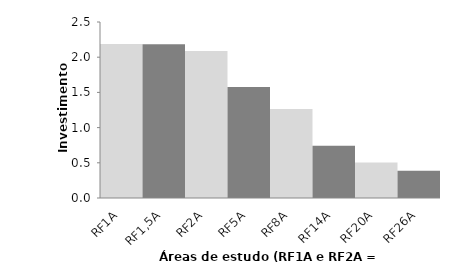
| Category | Series 0 |
|---|---|
| RF1A | 2.187 |
| RF1,5A | 2.184 |
| RF2A | 2.089 |
| RF5A | 1.577 |
| RF8A | 1.264 |
| RF14A | 0.743 |
| RF20A | 0.505 |
| RF26A | 0.388 |